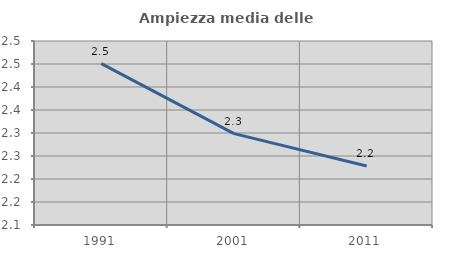
| Category | Ampiezza media delle famiglie |
|---|---|
| 1991.0 | 2.451 |
| 2001.0 | 2.299 |
| 2011.0 | 2.228 |